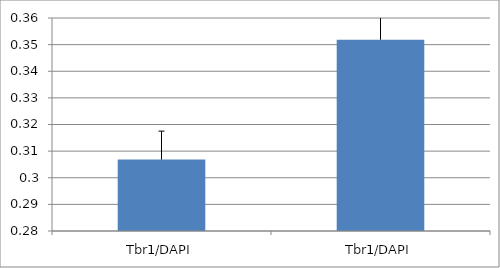
| Category | Series 0 |
|---|---|
| Tbr1/DAPI | 0.307 |
| Tbr1/DAPI | 0.352 |